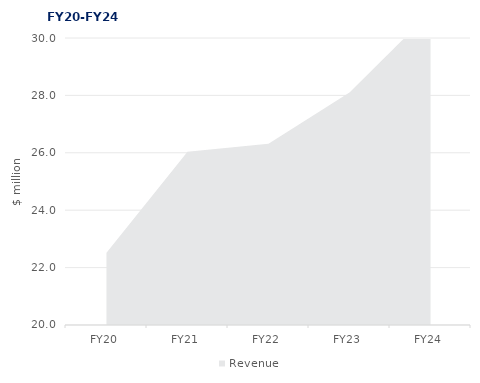
| Category | Revenue |
|---|---|
| FY20 | 22.515 |
| FY21 | 26.033 |
| FY22 | 26.315 |
| FY23 | 28.1 |
| FY24 | 30.9 |